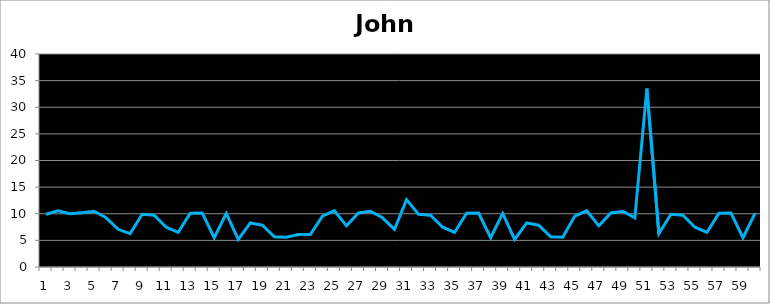
| Category | John |
|---|---|
| 0 | 9.903 |
| 1 | 10.555 |
| 2 | 10.001 |
| 3 | 10.201 |
| 4 | 10.479 |
| 5 | 9.241 |
| 6 | 7.08 |
| 7 | 6.278 |
| 8 | 9.905 |
| 9 | 9.719 |
| 10 | 7.466 |
| 11 | 6.505 |
| 12 | 10.093 |
| 13 | 10.122 |
| 14 | 5.49 |
| 15 | 10.057 |
| 16 | 5.175 |
| 17 | 8.278 |
| 18 | 7.849 |
| 19 | 5.677 |
| 20 | 5.575 |
| 21 | 6.111 |
| 22 | 6.123 |
| 23 | 9.529 |
| 24 | 10.572 |
| 25 | 7.733 |
| 26 | 10.147 |
| 27 | 10.479 |
| 28 | 9.241 |
| 29 | 7.08 |
| 30 | 12.66 |
| 31 | 9.905 |
| 32 | 9.719 |
| 33 | 7.466 |
| 34 | 6.505 |
| 35 | 10.093 |
| 36 | 10.122 |
| 37 | 5.49 |
| 38 | 10.057 |
| 39 | 5.175 |
| 40 | 8.278 |
| 41 | 7.849 |
| 42 | 5.677 |
| 43 | 5.575 |
| 44 | 9.529 |
| 45 | 10.572 |
| 46 | 7.733 |
| 47 | 10.147 |
| 48 | 10.479 |
| 49 | 9.241 |
| 50 | 33.518 |
| 51 | 6.278 |
| 52 | 9.905 |
| 53 | 9.719 |
| 54 | 7.466 |
| 55 | 6.505 |
| 56 | 10.093 |
| 57 | 10.122 |
| 58 | 5.49 |
| 59 | 10.057 |